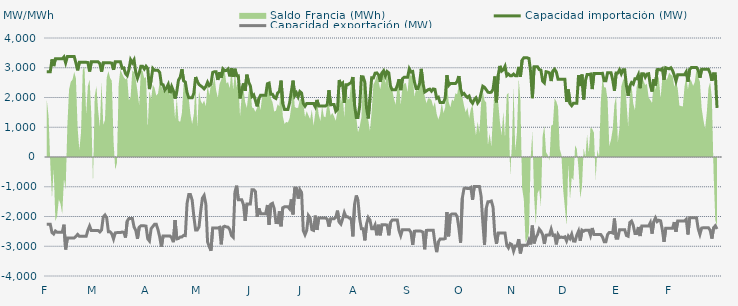
| Category | Capacidad importación (MW) | Capacidad exportación (MW) |
|---|---|---|
| 0 | 2866.667 | -2262.5 |
| 1900-01-01 | 2866.667 | -2262.5 |
| 1900-01-02 | 2866.667 | -2262.5 |
| 1900-01-03 | 3281.25 | -2537.5 |
| 1900-01-04 | 3056.25 | -2587.5 |
| 1900-01-05 | 3300 | -2487.5 |
| 1900-01-06 | 3300 | -2529.167 |
| 1900-01-07 | 3300 | -2529.167 |
| 1900-01-08 | 3300 | -2529.167 |
| 1900-01-09 | 3300 | -2529.167 |
| 1900-01-10 | 3362.5 | -2275 |
| 1900-01-11 | 3166.667 | -3106.25 |
| 1900-01-12 | 3375 | -2718.75 |
| 1900-01-13 | 3375 | -2718.75 |
| 1900-01-14 | 3375 | -2718.75 |
| 1900-01-15 | 3375 | -2718.75 |
| 1900-01-16 | 3375 | -2718.75 |
| 1900-01-17 | 3162.5 | -2668.75 |
| 1900-01-18 | 2912.5 | -2602.083 |
| 1900-01-19 | 3183.333 | -2666.667 |
| 1900-01-20 | 3183.333 | -2666.667 |
| 1900-01-21 | 3183.333 | -2666.667 |
| 1900-01-22 | 3183.333 | -2666.667 |
| 1900-01-23 | 3183.333 | -2666.667 |
| 1900-01-24 | 3175 | -2462.5 |
| 1900-01-25 | 2875 | -2320.833 |
| 1900-01-26 | 3200 | -2470.833 |
| 1900-01-27 | 3200 | -2470.833 |
| 1900-01-28 | 3200 | -2470.833 |
| 1900-01-29 | 3200 | -2470.833 |
| 1900-01-30 | 3200 | -2470.833 |
| 1900-01-31 | 3143.75 | -2518.75 |
| 1900-02-01 | 2868.75 | -2452.083 |
| 1900-02-02 | 3166.667 | -2014.583 |
| 1900-02-03 | 3166.667 | -1950 |
| 1900-02-04 | 3166.667 | -2043.75 |
| 1900-02-05 | 3166.667 | -2512.5 |
| 1900-02-06 | 3166.667 | -2514.583 |
| 1900-02-07 | 3154.167 | -2581.25 |
| 1900-02-08 | 2931.25 | -2756.25 |
| 1900-02-09 | 3204.167 | -2552.083 |
| 1900-02-10 | 3204.167 | -2541.667 |
| 1900-02-11 | 3204.167 | -2541.667 |
| 1900-02-12 | 3204.167 | -2541.667 |
| 1900-02-13 | 2985.417 | -2522.917 |
| 1900-02-14 | 2995.833 | -2531.25 |
| 1900-02-15 | 2804.167 | -2706.25 |
| 1900-02-16 | 2737.5 | -2154.167 |
| 1900-02-17 | 2937.5 | -2066.667 |
| 1900-02-18 | 3266.667 | -2066.667 |
| 1900-02-19 | 3166.667 | -2066.667 |
| 1900-02-20 | 3266.667 | -2352.083 |
| 1900-02-21 | 2843.75 | -2462.5 |
| 1900-02-22 | 2647.826 | -2752.174 |
| 1900-02-23 | 2812.5 | -2364.583 |
| 1900-02-24 | 3050 | -2312.5 |
| 1900-02-25 | 3050 | -2312.5 |
| 1900-02-26 | 2958.333 | -2312.5 |
| 1900-02-27 | 3050 | -2322.917 |
| 1900-02-28 | 2975 | -2750 |
| 1900-02-28 | 2282.542 | -2822.917 |
| 1900-03-01 | 2591.667 | -2406.25 |
| 1900-03-02 | 2975 | -2335.417 |
| 1900-03-03 | 2912.5 | -2260.417 |
| 1900-03-04 | 2912.5 | -2260.417 |
| 1900-03-05 | 2912.5 | -2439.583 |
| 1900-03-06 | 2841.667 | -2687.5 |
| 1900-03-07 | 2450 | -3012.5 |
| 1900-03-08 | 2429.167 | -2654.167 |
| 1900-03-09 | 2245.833 | -2654.167 |
| 1900-03-10 | 2320.833 | -2654.167 |
| 1900-03-11 | 2437.5 | -2654.167 |
| 1900-03-12 | 2147.917 | -2654.167 |
| 1900-03-13 | 2366.667 | -2712.5 |
| 1900-03-14 | 2225 | -2862.5 |
| 1900-03-15 | 1962.5 | -2118.75 |
| 1900-03-16 | 2204.167 | -2754.167 |
| 1900-03-17 | 2587.5 | -2737.5 |
| 1900-03-18 | 2681.25 | -2687.5 |
| 1900-03-19 | 2950 | -2687.5 |
| 1900-03-20 | 2556.25 | -2631.25 |
| 1900-03-21 | 2520.833 | -2641.667 |
| 1900-03-22 | 2166.667 | -1562.5 |
| 1900-03-23 | 1987.5 | -1264.583 |
| 1900-03-24 | 1987.5 | -1264.583 |
| 1900-03-25 | 1987.5 | -1450 |
| 1900-03-26 | 2152.083 | -2012.5 |
| 1900-03-27 | 2687.5 | -2450 |
| 1900-03-28 | 2537.5 | -2450 |
| 1900-03-29 | 2437.5 | -2350 |
| 1900-03-30 | 2391.667 | -1816.667 |
| 1900-03-31 | 2350 | -1381.25 |
| 1900-04-01 | 2292.958 | -1291.667 |
| 1900-04-02 | 2366.667 | -1583.333 |
| 1900-04-03 | 2512.5 | -2850 |
| 1900-04-04 | 2400 | -3012.5 |
| 1900-04-05 | 2450 | -3150 |
| 1900-04-06 | 2841.667 | -2387.5 |
| 1900-04-07 | 2866.667 | -2387.5 |
| 1900-04-08 | 2866.667 | -2387.5 |
| 1900-04-09 | 2591.667 | -2387.5 |
| 1900-04-10 | 2847.917 | -2364.583 |
| 1900-04-11 | 2662.5 | -2935.417 |
| 1900-04-12 | 2958.333 | -2354.167 |
| 1900-04-13 | 2900 | -2327.083 |
| 1900-04-14 | 2908.333 | -2350 |
| 1900-04-15 | 2958.333 | -2360.417 |
| 1900-04-16 | 2710.417 | -2437.5 |
| 1900-04-17 | 2981.25 | -2637.5 |
| 1900-04-18 | 2693.75 | -2697.917 |
| 1900-04-19 | 2966.667 | -1183.333 |
| 1900-04-20 | 2733.333 | -964.583 |
| 1900-04-21 | 2733.333 | -1437.5 |
| 1900-04-22 | 1968.75 | -1437.5 |
| 1900-04-23 | 2266.667 | -1437.5 |
| 1900-04-24 | 2472.917 | -1600 |
| 1900-04-25 | 2222.917 | -2150 |
| 1900-04-26 | 2766.667 | -1583.333 |
| 1900-04-27 | 2516.667 | -1583.333 |
| 1900-04-28 | 2400 | -1583.333 |
| 1900-04-29 | 2035.417 | -1097.917 |
| 1900-04-30 | 2087.5 | -1097.917 |
| 1900-05-01 | 1897.917 | -1162.5 |
| 1900-05-02 | 1702.083 | -2010.417 |
| 1900-05-03 | 1956.25 | -1725 |
| 1900-05-04 | 2075 | -1906.25 |
| 1900-05-05 | 2075 | -1906.25 |
| 1900-05-06 | 2075 | -1906.25 |
| 1900-05-07 | 2075 | -1906.25 |
| 1900-05-08 | 2462.5 | -1612.5 |
| 1900-05-09 | 2485.417 | -2277.083 |
| 1900-05-10 | 2106.25 | -1587.5 |
| 1900-05-11 | 2108.333 | -1556.25 |
| 1900-05-12 | 2000 | -1737.5 |
| 1900-05-13 | 1966.667 | -2202.083 |
| 1900-05-14 | 2152.083 | -2206.25 |
| 1900-05-15 | 2200 | -1825 |
| 1900-05-16 | 2566.667 | -2329.167 |
| 1900-05-17 | 1800 | -1706.25 |
| 1900-05-18 | 1600 | -1672.917 |
| 1900-05-19 | 1600 | -1672.917 |
| 1900-05-20 | 1600 | -1672.917 |
| 1900-05-21 | 1825 | -1743.75 |
| 1900-05-22 | 2200 | -1425 |
| 1900-05-23 | 2566.667 | -1929.167 |
| 1900-05-24 | 2062.5 | -1041.667 |
| 1900-05-25 | 2154.167 | -1045.833 |
| 1900-05-26 | 2020.833 | -1400 |
| 1900-05-27 | 2200 | -1100 |
| 1900-05-28 | 2150 | -1193.75 |
| 1900-05-29 | 1800 | -2475 |
| 1900-05-30 | 1708.333 | -2612.5 |
| 1900-05-31 | 1800 | -2466.667 |
| 1900-06-01 | 1800 | -1966.667 |
| 1900-06-02 | 1800 | -2050 |
| 1900-06-03 | 1800 | -2441.667 |
| 1900-06-04 | 1800 | -2466.667 |
| 1900-06-05 | 1687.5 | -1970.833 |
| 1900-06-06 | 1918.75 | -2452.083 |
| 1900-06-07 | 1712.5 | -2047.917 |
| 1900-06-08 | 1712.5 | -2047.917 |
| 1900-06-09 | 1712.5 | -2047.917 |
| 1900-06-10 | 1712.5 | -2047.917 |
| 1900-06-11 | 1712.5 | -2047.917 |
| 1900-06-12 | 1762.5 | -2087.5 |
| 1900-06-13 | 2243.75 | -2339.583 |
| 1900-06-14 | 1754.167 | -2075 |
| 1900-06-15 | 1762.5 | -2075 |
| 1900-06-16 | 1762.5 | -2075 |
| 1900-06-17 | 1537.5 | -2029.167 |
| 1900-06-18 | 1600 | -1802.083 |
| 1900-06-19 | 2587.5 | -2187.5 |
| 1900-06-20 | 2425 | -2256.25 |
| 1900-06-21 | 2481.25 | -2081.25 |
| 1900-06-22 | 1825 | -1868.75 |
| 1900-06-23 | 2425 | -2012.5 |
| 1900-06-24 | 2425 | -2012.5 |
| 1900-06-25 | 2468.75 | -2056.25 |
| 1900-06-26 | 2500 | -2079.167 |
| 1900-06-27 | 2687.5 | -2666.667 |
| 1900-06-28 | 1745.833 | -1589.583 |
| 1900-06-29 | 1329.167 | -1291.667 |
| 1900-06-30 | 1329.167 | -1464.583 |
| 1900-07-01 | 1720.833 | -2091.667 |
| 1900-07-02 | 2700 | -2412.5 |
| 1900-07-03 | 2693.75 | -2412.5 |
| 1900-07-04 | 2512.5 | -2802.083 |
| 1900-07-05 | 1639.583 | -2254.167 |
| 1900-07-06 | 1295.833 | -2033.333 |
| 1900-07-07 | 1956.25 | -2118.75 |
| 1900-07-08 | 2662.5 | -2412.5 |
| 1900-07-09 | 2658.333 | -2412.5 |
| 1900-07-10 | 2816.667 | -2287.5 |
| 1900-07-11 | 2827.083 | -2631.25 |
| 1900-07-12 | 2764.583 | -2277.083 |
| 1900-07-13 | 2525 | -2631.25 |
| 1900-07-14 | 2825 | -2277.083 |
| 1900-07-15 | 2900 | -2277.083 |
| 1900-07-16 | 2725 | -2277.083 |
| 1900-07-17 | 2875 | -2287.5 |
| 1900-07-18 | 2829.167 | -2631.25 |
| 1900-07-19 | 2383.333 | -2202.083 |
| 1900-07-20 | 2258.333 | -2120.833 |
| 1900-07-21 | 2258.333 | -2120.833 |
| 1900-07-22 | 2258.333 | -2120.833 |
| 1900-07-23 | 2404.167 | -2120.833 |
| 1900-07-24 | 2612.5 | -2468.75 |
| 1900-07-25 | 2247.917 | -2639.583 |
| 1900-07-26 | 2631.25 | -2443.75 |
| 1900-07-27 | 2679.167 | -2443.75 |
| 1900-07-28 | 2679.167 | -2443.75 |
| 1900-07-29 | 2679.167 | -2443.75 |
| 1900-07-30 | 2966.667 | -2447.917 |
| 1900-07-31 | 2858.333 | -2537.5 |
| 1900-08-01 | 2875 | -2954.167 |
| 1900-08-02 | 2525 | -2495.833 |
| 1900-08-03 | 2300 | -2485.417 |
| 1900-08-04 | 2300 | -2485.417 |
| 1900-08-05 | 2462.5 | -2485.417 |
| 1900-08-06 | 2962.5 | -2495.833 |
| 1900-08-07 | 2475 | -2525 |
| 1900-08-08 | 2183.333 | -3102.083 |
| 1900-08-09 | 2220.833 | -2468.75 |
| 1900-08-10 | 2262.5 | -2458.333 |
| 1900-08-11 | 2281.25 | -2458.333 |
| 1900-08-12 | 2212.5 | -2458.333 |
| 1900-08-13 | 2287.5 | -2458.333 |
| 1900-08-14 | 2275 | -2893.75 |
| 1900-08-15 | 1975 | -3197.917 |
| 1900-08-16 | 2008.333 | -2852.083 |
| 1900-08-17 | 1833.333 | -2760.417 |
| 1900-08-18 | 1833.333 | -2760.417 |
| 1900-08-19 | 1833.333 | -2760.417 |
| 1900-08-20 | 1979.167 | -2739.583 |
| 1900-08-21 | 2750 | -1850 |
| 1900-08-22 | 2404.167 | -2666.667 |
| 1900-08-23 | 2466.667 | -1950 |
| 1900-08-24 | 2466.667 | -1912.5 |
| 1900-08-25 | 2466.667 | -1912.5 |
| 1900-08-26 | 2466.667 | -1912.5 |
| 1900-08-27 | 2541.667 | -1995.833 |
| 1900-08-28 | 2720.833 | -2387.5 |
| 1900-08-29 | 2293.75 | -2879.167 |
| 1900-08-30 | 2097.917 | -1387.5 |
| 1900-08-31 | 2137.5 | -1062.5 |
| 1900-09-01 | 2058.333 | -1041.667 |
| 1900-09-02 | 2002.083 | -1062.5 |
| 1900-09-03 | 2047.917 | -1062.5 |
| 1900-09-04 | 1879.167 | -1025 |
| 1900-09-05 | 1808.333 | -1437.5 |
| 1900-09-06 | 1925 | -987.5 |
| 1900-09-07 | 1987.5 | -987.5 |
| 1900-09-08 | 1816.667 | -987.5 |
| 1900-09-09 | 1895.833 | -987.5 |
| 1900-09-10 | 2141.708 | -1312.5 |
| 1900-09-11 | 2379.167 | -2187.5 |
| 1900-09-12 | 2341.667 | -2950 |
| 1900-09-13 | 2262.5 | -1725 |
| 1900-09-14 | 2179.167 | -1500 |
| 1900-09-15 | 2166.667 | -1500 |
| 1900-09-16 | 2179.167 | -1479.167 |
| 1900-09-17 | 2275 | -1687.5 |
| 1900-09-18 | 2704.167 | -2593.75 |
| 1900-09-19 | 1837.5 | -2920.833 |
| 1900-09-20 | 2750 | -2558.333 |
| 1900-09-21 | 3062.5 | -2558.333 |
| 1900-09-22 | 2887.5 | -2558.333 |
| 1900-09-23 | 2933.333 | -2558.333 |
| 1900-09-24 | 3050 | -2558.333 |
| 1900-09-25 | 2737.5 | -2956.25 |
| 1900-09-26 | 2788 | -3052 |
| 1900-09-27 | 2733.333 | -2912.5 |
| 1900-09-28 | 2733.333 | -2945.833 |
| 1900-09-29 | 2787.5 | -3162.5 |
| 1900-09-30 | 2733.333 | -2987.5 |
| 1900-10-01 | 2733.333 | -2987.5 |
| 1900-10-02 | 3029.167 | -2762.5 |
| 1900-10-03 | 2695.833 | -3239.583 |
| 1900-10-04 | 3258.333 | -2966.667 |
| 1900-10-05 | 3333.333 | -2966.667 |
| 1900-10-06 | 3333.333 | -2966.667 |
| 1900-10-07 | 3333.333 | -2966.667 |
| 1900-10-08 | 3312.5 | -2793.75 |
| 1900-10-09 | 2843.75 | -2937.5 |
| 1900-10-10 | 1977.083 | -2306.25 |
| 1900-10-11 | 3033.333 | -2904.167 |
| 1900-10-12 | 3033.333 | -2710.417 |
| 1900-10-13 | 3033.333 | -2608.333 |
| 1900-10-14 | 2939.583 | -2420.833 |
| 1900-10-15 | 2920.833 | -2495.833 |
| 1900-10-16 | 2550 | -2612.5 |
| 1900-10-17 | 2491.667 | -2922.917 |
| 1900-10-18 | 2866.667 | -2629.167 |
| 1900-10-19 | 2854.167 | -2618.75 |
| 1900-10-20 | 2825 | -2622.917 |
| 1900-10-21 | 2554.167 | -2429.167 |
| 1900-10-22 | 2891.667 | -2635.417 |
| 1900-10-23 | 2950 | -2622.917 |
| 1900-10-24 | 2858.333 | -2937.5 |
| 1900-10-25 | 2616.667 | -2608.333 |
| 1900-10-26 | 2616.667 | -2708.333 |
| 1900-10-27 | 2616.667 | -2691.667 |
| 1900-10-28 | 2616.667 | -2708.333 |
| 1900-10-29 | 2616.667 | -2683.333 |
| 1900-10-30 | 1850 | -2820.833 |
| 1900-10-31 | 2268.75 | -2658.333 |
| 1900-11-01 | 1795.833 | -2741.667 |
| 1900-11-02 | 1725 | -2595.833 |
| 1900-11-03 | 1808.333 | -2825 |
| 1900-11-04 | 1808.333 | -2829.167 |
| 1900-11-05 | 1808.333 | -2622.917 |
| 1900-11-06 | 2750 | -2491.667 |
| 1900-11-07 | 2385.417 | -2816.667 |
| 1900-11-08 | 2770.833 | -2458.333 |
| 1900-11-09 | 1937.5 | -2495.833 |
| 1900-11-10 | 2562.5 | -2458.333 |
| 1900-11-11 | 2770.833 | -2458.333 |
| 1900-11-12 | 2770.833 | -2458.333 |
| 1900-11-13 | 2787.5 | -2637.5 |
| 1900-11-14 | 2283.333 | -2387.5 |
| 1900-11-15 | 2808.333 | -2606.25 |
| 1900-11-16 | 2808.333 | -2606.25 |
| 1900-11-17 | 2808.333 | -2606.25 |
| 1900-11-18 | 2808.333 | -2606.25 |
| 1900-11-19 | 2808.333 | -2606.25 |
| 1900-11-20 | 2812.5 | -2687.5 |
| 1900-11-21 | 2562.5 | -2847.917 |
| 1900-11-22 | 2562.5 | -2847.917 |
| 1900-11-23 | 2833.333 | -2606.25 |
| 1900-11-24 | 2833.333 | -2535.417 |
| 1900-11-25 | 2833.333 | -2535.417 |
| 1900-11-26 | 2587.5 | -2556.25 |
| 1900-11-27 | 2229.167 | -2068.75 |
| 1900-11-28 | 2825 | -2729.167 |
| 1900-11-29 | 2825 | -2729.167 |
| 1900-11-30 | 2933.333 | -2441.667 |
| 1900-12-01 | 2795.833 | -2441.667 |
| 1900-12-02 | 2933.333 | -2441.667 |
| 1900-12-03 | 2933.333 | -2441.667 |
| 1900-12-04 | 2397.917 | -2637.5 |
| 1900-12-05 | 2056.25 | -2662.5 |
| 1900-12-06 | 2383.333 | -2202.083 |
| 1900-12-07 | 2500 | -2154.167 |
| 1900-12-08 | 2450 | -2293.75 |
| 1900-12-09 | 2633.333 | -2570.833 |
| 1900-12-10 | 2633.333 | -2570.833 |
| 1900-12-11 | 2762.5 | -2352.083 |
| 1900-12-12 | 2312.5 | -2656.25 |
| 1900-12-13 | 2800 | -2322.917 |
| 1900-12-14 | 2800 | -2322.917 |
| 1900-12-15 | 2683.333 | -2322.917 |
| 1900-12-16 | 2787.5 | -2322.917 |
| 1900-12-17 | 2800 | -2322.917 |
| 1900-12-18 | 2412.5 | -2206.25 |
| 1900-12-19 | 2200 | -2575 |
| 1900-12-20 | 2616.667 | -2170.833 |
| 1900-12-21 | 2404.167 | -2045.833 |
| 1900-12-22 | 2937.5 | -2170.833 |
| 1900-12-23 | 2941.667 | -2125 |
| 1900-12-24 | 2925 | -2145.833 |
| 1900-12-25 | 2968.75 | -2437.5 |
| 1900-12-26 | 2593.75 | -2854.167 |
| 1900-12-27 | 3000 | -2395.833 |
| 1900-12-28 | 2979.167 | -2395.833 |
| 1900-12-29 | 2964.583 | -2395.833 |
| 1900-12-30 | 3000 | -2395.833 |
| 1900-12-31 | 2906.25 | -2395.833 |
| 1901-01-01 | 2750 | -2187.5 |
| 1901-01-02 | 2550 | -2512.5 |
| 1901-01-03 | 2766.667 | -2154.167 |
| 1901-01-04 | 2766.667 | -2154.167 |
| 1901-01-05 | 2766.667 | -2154.167 |
| 1901-01-06 | 2766.667 | -2154.167 |
| 1901-01-07 | 2766.667 | -2154.167 |
| 1901-01-08 | 2862.5 | -2093.75 |
| 1901-01-09 | 2529.167 | -2604.167 |
| 1901-01-10 | 2945.833 | -2041.667 |
| 1901-01-11 | 3008.333 | -2041.667 |
| 1901-01-12 | 3008.333 | -2041.667 |
| 1901-01-13 | 3008.333 | -2041.667 |
| 1901-01-14 | 3008.333 | -2041.667 |
| 1901-01-15 | 2922.917 | -2412.5 |
| 1901-01-16 | 2662.5 | -2600 |
| 1901-01-17 | 2945.833 | -2389.583 |
| 1901-01-18 | 2945.833 | -2377.083 |
| 1901-01-19 | 2945.833 | -2377.083 |
| 1901-01-20 | 2945.833 | -2377.083 |
| 1901-01-21 | 2945.833 | -2379.167 |
| 1901-01-22 | 2812.5 | -2462.5 |
| 1901-01-23 | 2562.5 | -2741.667 |
| 1901-01-24 | 2802.083 | -2377.083 |
| 1901-01-25 | 2800 | -2312.5 |
| 1901-01-26 | 1650 | -2420.833 |